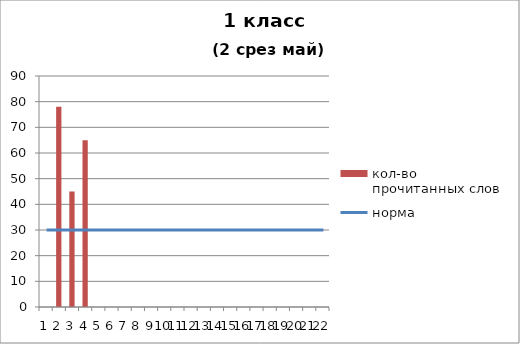
| Category | кол-во прочитанных слов |
|---|---|
| 0 | 0 |
| 1 | 78 |
| 2 | 45 |
| 3 | 65 |
| 4 | 0 |
| 5 | 0 |
| 6 | 0 |
| 7 | 0 |
| 8 | 0 |
| 9 | 0 |
| 10 | 0 |
| 11 | 0 |
| 12 | 0 |
| 13 | 0 |
| 14 | 0 |
| 15 | 0 |
| 16 | 0 |
| 17 | 0 |
| 18 | 0 |
| 19 | 0 |
| 20 | 0 |
| 21 | 0 |